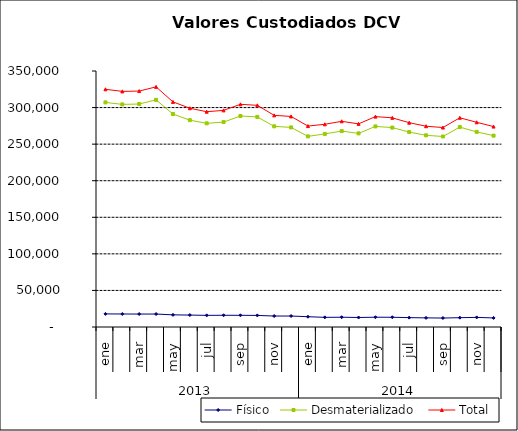
| Category | Físico | Desmaterializado | Total |
|---|---|---|---|
| 0 | 17921.653 | 307082.68 | 325004.333 |
| 1900-01-01 | 17780.827 | 304347.313 | 322128.139 |
| 1900-01-02 | 17695.667 | 304854.166 | 322549.833 |
| 1900-01-03 | 17723.071 | 310584.153 | 328307.224 |
| 1900-01-04 | 16615.651 | 291164.134 | 307779.784 |
| 1900-01-05 | 16318.639 | 282792.334 | 299110.974 |
| 1900-01-06 | 15915.791 | 278455.193 | 294370.984 |
| 1900-01-07 | 16022.201 | 280146.291 | 296168.491 |
| 1900-01-08 | 15985.343 | 288455.62 | 304440.963 |
| 1900-01-09 | 15832.799 | 287224.805 | 303057.604 |
| 1900-01-10 | 14989.327 | 274347.685 | 289337.013 |
| 1900-01-11 | 15002.978 | 272880.592 | 287883.571 |
| 1900-01-12 | 14063.964 | 260638.354 | 274702.317 |
| 1900-01-13 | 13190.877 | 263956.944 | 277147.821 |
| 1900-01-14 | 13384.635 | 267835.215 | 281219.85 |
| 1900-01-15 | 13006.697 | 264721.528 | 277728.225 |
| 1900-01-16 | 13383.671 | 274245.968 | 287629.639 |
| 1900-01-17 | 13329.902 | 272643.72 | 285973.621 |
| 1900-01-18 | 12797.233 | 266526.797 | 279324.03 |
| 1900-01-19 | 12469.167 | 262034.791 | 274503.958 |
| 1900-01-20 | 12224.2 | 260483.18 | 272707.38 |
| 1900-01-21 | 12733.283 | 273303.267 | 286036.549 |
| 1900-01-22 | 13125.107 | 266757.246 | 279882.352 |
| 1900-01-23 | 12406.948 | 261608.521 | 274015.469 |